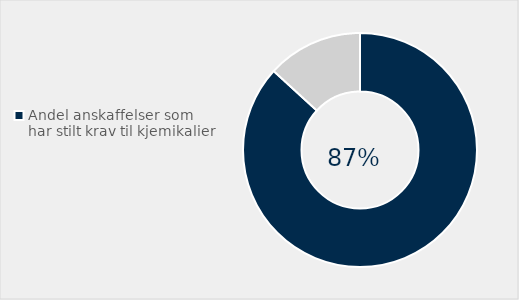
| Category | Series 0 |
|---|---|
| Andel anskaffelser som har stilt krav til kjemikalier | 0.868 |
| Har ikke stilt krav til kjemikalier | 0.132 |